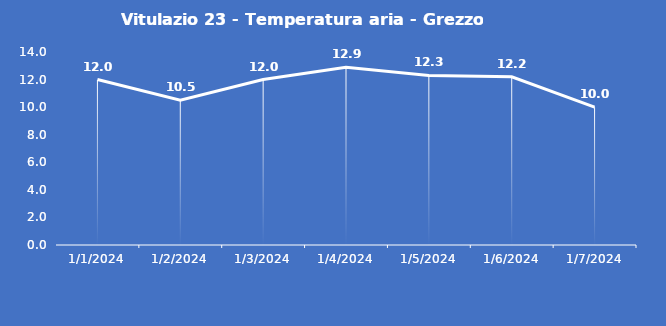
| Category | Vitulazio 23 - Temperatura aria - Grezzo (°C) |
|---|---|
| 1/1/24 | 12 |
| 1/2/24 | 10.5 |
| 1/3/24 | 12 |
| 1/4/24 | 12.9 |
| 1/5/24 | 12.3 |
| 1/6/24 | 12.2 |
| 1/7/24 | 10 |